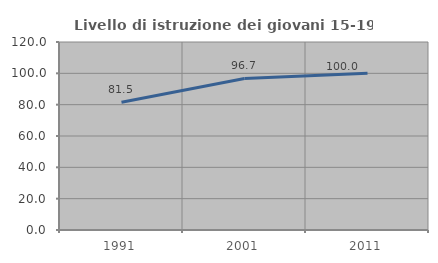
| Category | Livello di istruzione dei giovani 15-19 anni |
|---|---|
| 1991.0 | 81.507 |
| 2001.0 | 96.703 |
| 2011.0 | 100 |